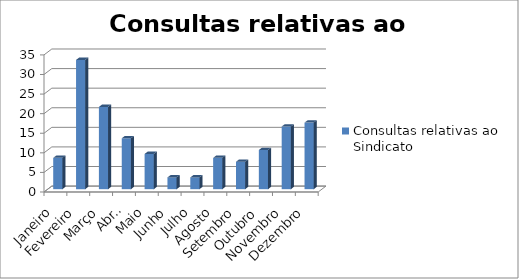
| Category | Consultas relativas ao Sindicato |
|---|---|
| Janeiro | 8 |
| Fevereiro | 33 |
| Março | 21 |
| Abril | 13 |
| Maio | 9 |
| Junho | 3 |
| Julho | 3 |
| Agosto | 8 |
| Setembro | 7 |
| Outubro | 10 |
| Novembro | 16 |
| Dezembro | 17 |